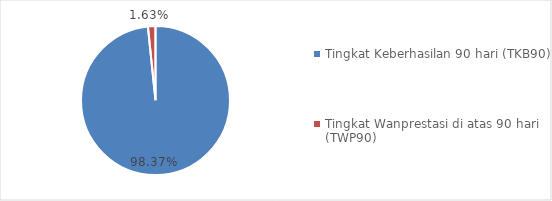
| Category | Series 0 |
|---|---|
| Tingkat Keberhasilan 90 hari (TKB90) | 0.984 |
| Tingkat Wanprestasi di atas 90 hari (TWP90) | 0.016 |